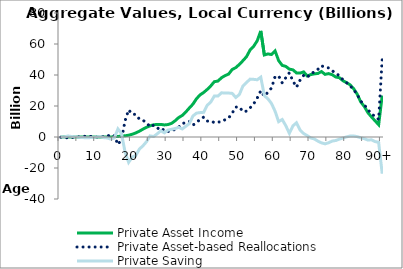
| Category | Private Asset Income | Private Asset-based Reallocations | Private Saving |
|---|---|---|---|
| 0 | 0 | -145.834 | 145.834 |
|  | 0 | -9.311 | 9.311 |
| 2 | 0 | -647.15 | 647.15 |
| 3 | 0 | -310.88 | 310.88 |
| 4 | 0 | -138.492 | 138.492 |
| 5 | 0 | 131.347 | -131.347 |
| 6 | 0 | 350.446 | -350.446 |
| 7 | 0 | 470.157 | -470.157 |
| 8 | 0 | 423.278 | -423.278 |
| 9 | 0 | 306.83 | -306.83 |
| 10 | 0 | -45.301 | 45.301 |
| 11 | 0 | -279.93 | 279.93 |
| 12 | 0 | 401.767 | -401.767 |
| 13 | 0 | 621.637 | -621.637 |
| 14 | 0 | 1354.354 | -1354.354 |
| 15 | 223.114 | 825.222 | -602.108 |
| 16 | 330.942 | -4878.557 | 5209.499 |
| 17 | 618.621 | -1591.644 | 2210.265 |
| 18 | 773.736 | 10521.647 | -9747.911 |
| 19 | 1156.859 | 17533.576 | -16376.717 |
| 20 | 1769.528 | 14725.398 | -12955.87 |
| 21 | 2625.019 | 14557.843 | -11932.824 |
| 22 | 3729.368 | 11554.889 | -7825.521 |
| 23 | 5058.154 | 10758.102 | -5699.948 |
| 24 | 6242.184 | 9268.881 | -3026.697 |
| 25 | 7202.853 | 6508.972 | 693.881 |
| 26 | 7915.863 | 7612.064 | 303.8 |
| 27 | 8062.33 | 6025.064 | 2037.266 |
| 28 | 8140.715 | 4137.323 | 4003.391 |
| 29 | 7783.393 | 5094.586 | 2688.806 |
| 30 | 8025.831 | 3563.107 | 4462.724 |
| 31 | 8778.443 | 3810.757 | 4967.686 |
| 32 | 10449.761 | 5008.875 | 5440.886 |
| 33 | 12536.362 | 6329.512 | 6206.85 |
| 34 | 13888.58 | 8705.907 | 5182.673 |
| 35 | 16129.845 | 9230.986 | 6898.859 |
| 36 | 18730.119 | 10097.482 | 8632.637 |
| 37 | 21207.407 | 7655.724 | 13551.683 |
| 38 | 24689.13 | 9290.482 | 15398.648 |
| 39 | 27179.516 | 11427.287 | 15752.229 |
| 40 | 28715.384 | 12807.228 | 15908.156 |
| 41 | 30697.306 | 10255.963 | 20441.343 |
| 42 | 32968.658 | 10409.646 | 22559.012 |
| 43 | 35696.083 | 9247.799 | 26448.283 |
| 44 | 36082.327 | 9665.862 | 26416.465 |
| 45 | 38237.77 | 9759.421 | 28478.349 |
| 46 | 39598.497 | 11164.333 | 28434.165 |
| 47 | 40599.639 | 12239.39 | 28360.249 |
| 48 | 43590.181 | 15446.279 | 28143.902 |
| 49 | 44776.558 | 19291.334 | 25485.224 |
| 50 | 46818.391 | 19411.991 | 27406.4 |
| 51 | 49238.193 | 16362.718 | 32875.475 |
| 52 | 51803.905 | 16687.485 | 35116.42 |
| 53 | 56117.445 | 18771.201 | 37346.244 |
| 54 | 58488.316 | 21300.813 | 37187.503 |
| 55 | 62068.571 | 25146.17 | 36922.401 |
| 56 | 68457.215 | 29851.221 | 38605.994 |
| 57 | 52925.925 | 26268.446 | 26657.48 |
| 58 | 53584.973 | 28947.125 | 24637.848 |
| 59 | 53217.971 | 31589.492 | 21628.48 |
| 60 | 55538.489 | 38908.712 | 16629.777 |
| 61 | 49282.955 | 39397.106 | 9885.849 |
| 62 | 46222.975 | 34926.205 | 11296.77 |
| 63 | 45546.82 | 38242.788 | 7304.033 |
| 64 | 43796.485 | 41420.712 | 2375.773 |
| 65 | 43341.45 | 36163.374 | 7178.076 |
| 66 | 41330.769 | 32140.881 | 9189.888 |
| 67 | 41230.757 | 36751.756 | 4479.001 |
| 68 | 42002.489 | 39752.086 | 2250.403 |
| 69 | 39382.095 | 38501.189 | 880.906 |
| 70 | 40274.624 | 40922.785 | -648.161 |
| 71 | 40715.27 | 41970.88 | -1255.61 |
| 72 | 41010.206 | 43698.119 | -2687.914 |
| 73 | 42209.536 | 45989.478 | -3779.943 |
| 74 | 40414.838 | 44843.808 | -4428.97 |
| 75 | 40905.101 | 44597.59 | -3692.488 |
| 76 | 40184.502 | 42809.746 | -2625.245 |
| 77 | 38691.183 | 40951.961 | -2260.777 |
| 78 | 38252.662 | 39623.791 | -1371.129 |
| 79 | 36311.682 | 36969.335 | -657.653 |
| 80 | 35105.25 | 35049.318 | 55.932 |
| 81 | 33665.236 | 33020.332 | 644.903 |
| 82 | 31167.275 | 30522.301 | 644.975 |
| 83 | 27622.7 | 27387.055 | 235.646 |
| 84 | 22566.812 | 23105.658 | -538.846 |
| 85 | 19644.917 | 20718.56 | -1073.643 |
| 86 | 15671.327 | 17659.418 | -1988.091 |
| 87 | 12956.42 | 14741.825 | -1785.405 |
| 88 | 10439.433 | 13393.787 | -2954.355 |
| 89 | 7928.301 | 11354.521 | -3426.22 |
| 90+ | 26731.883 | 50426.536 | -23694.653 |